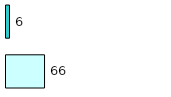
| Category | Series 0 | Series 1 |
|---|---|---|
| 0 | 66 | 6 |